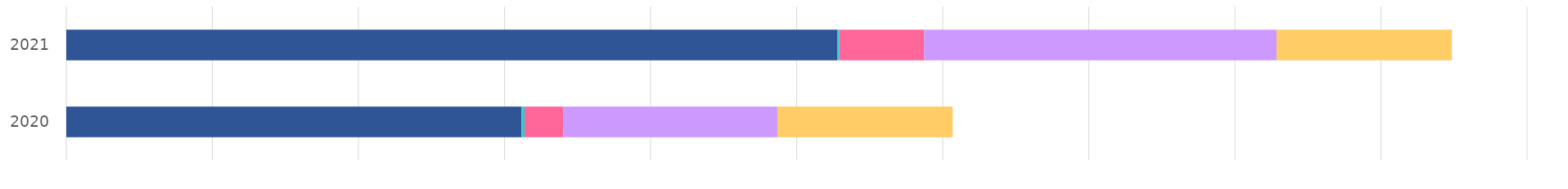
| Category | Streaming | Downloads & other digital | Physical | Performance rights | Synchronisation |
|---|---|---|---|---|---|
| 2020.0 | 31.162 | 0.211 | 2.666 | 14.64 | 12 |
| 2021.0 | 52.781 | 0.148 | 5.799 | 24.127 | 12 |